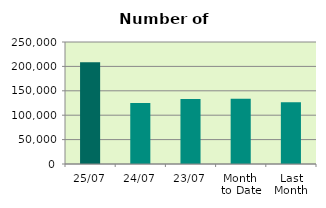
| Category | Series 0 |
|---|---|
| 25/07 | 208482 |
| 24/07 | 124946 |
| 23/07 | 133074 |
| Month 
to Date | 133862.105 |
| Last
Month | 126531 |